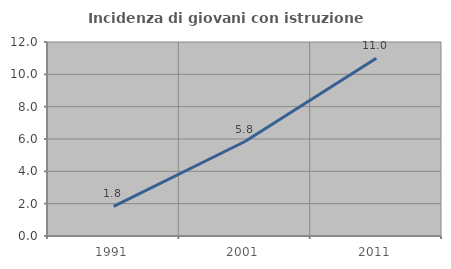
| Category | Incidenza di giovani con istruzione universitaria |
|---|---|
| 1991.0 | 1.835 |
| 2001.0 | 5.844 |
| 2011.0 | 11 |